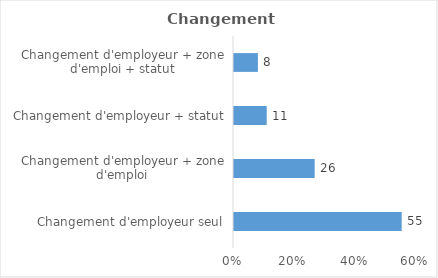
| Category | Series 0 |
|---|---|
| Changement d'employeur seul | 54.982 |
| Changement d'employeur + zone d'emploi | 26.456 |
| Changement d'employeur + statut | 10.726 |
| Changement d'employeur + zone d'emploi + statut | 7.836 |